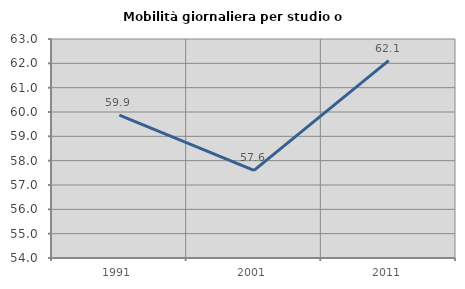
| Category | Mobilità giornaliera per studio o lavoro |
|---|---|
| 1991.0 | 59.87 |
| 2001.0 | 57.6 |
| 2011.0 | 62.108 |